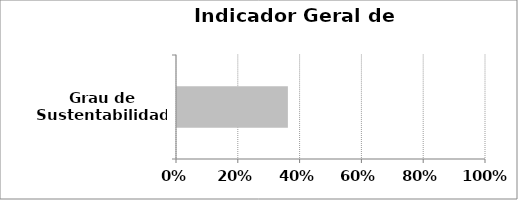
| Category | Grau de Sustentabilidade |
|---|---|
| Grau de Sustentabilidade | 0.359 |